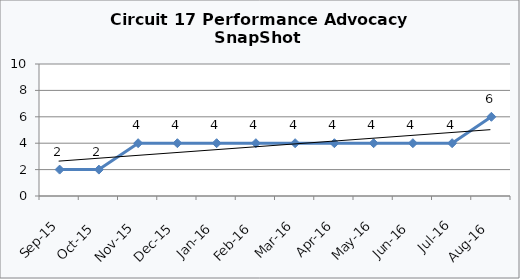
| Category | Circuit 17 |
|---|---|
| Sep-15 | 2 |
| Oct-15 | 2 |
| Nov-15 | 4 |
| Dec-15 | 4 |
| Jan-16 | 4 |
| Feb-16 | 4 |
| Mar-16 | 4 |
| Apr-16 | 4 |
| May-16 | 4 |
| Jun-16 | 4 |
| Jul-16 | 4 |
| Aug-16 | 6 |